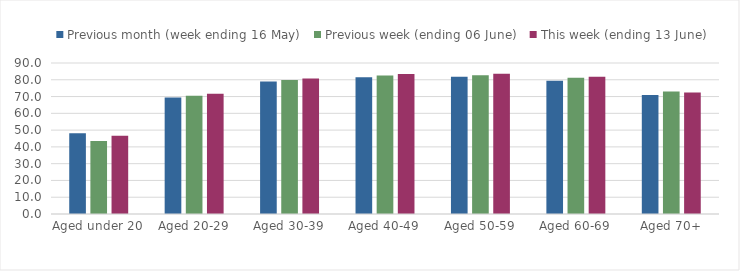
| Category | Previous month (week ending 16 May) | Previous week (ending 06 June) | This week (ending 13 June) |
|---|---|---|---|
| Aged under 20 | 48.133 | 43.543 | 46.639 |
| Aged 20-29 | 69.46 | 70.444 | 71.712 |
| Aged 30-39 | 78.928 | 79.929 | 80.726 |
| Aged 40-49 | 81.566 | 82.612 | 83.375 |
| Aged 50-59 | 81.783 | 82.641 | 83.569 |
| Aged 60-69 | 79.479 | 81.241 | 81.829 |
| Aged 70+ | 70.98 | 72.985 | 72.489 |